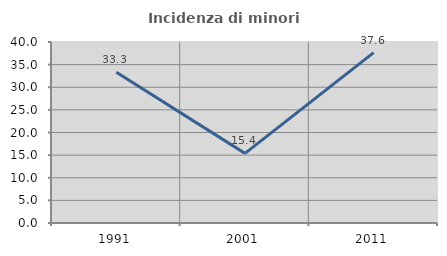
| Category | Incidenza di minori stranieri |
|---|---|
| 1991.0 | 33.333 |
| 2001.0 | 15.385 |
| 2011.0 | 37.64 |